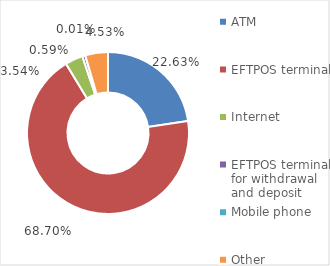
| Category | Number of transactions |
|---|---|
| ATM | 109416953 |
| EFTPOS terminal | 332185441 |
| Internet | 17133211 |
| EFTPOS terminal for withdrawal and deposit | 2857536 |
| Mobile phone | 40981 |
| Other | 21898918 |